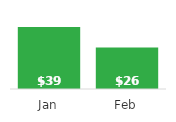
| Category | Net Profit |
|---|---|
| Jan | 39.318 |
| Feb | 26.314 |